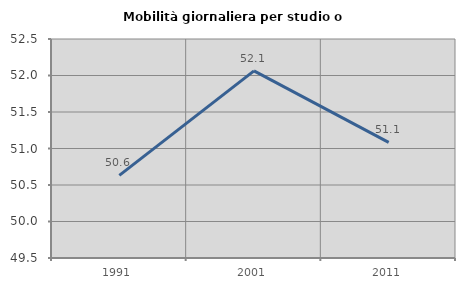
| Category | Mobilità giornaliera per studio o lavoro |
|---|---|
| 1991.0 | 50.632 |
| 2001.0 | 52.063 |
| 2011.0 | 51.083 |